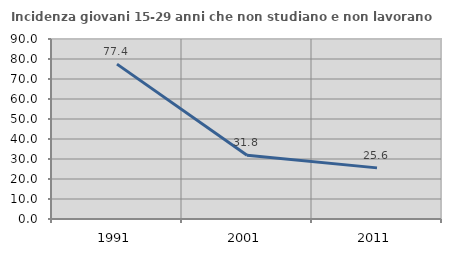
| Category | Incidenza giovani 15-29 anni che non studiano e non lavorano  |
|---|---|
| 1991.0 | 77.43 |
| 2001.0 | 31.84 |
| 2011.0 | 25.565 |